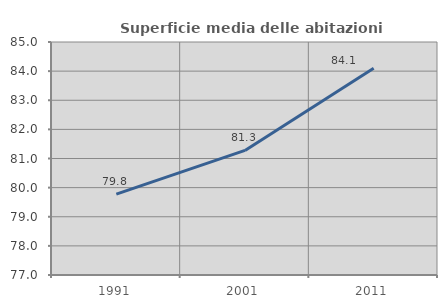
| Category | Superficie media delle abitazioni occupate |
|---|---|
| 1991.0 | 79.777 |
| 2001.0 | 81.277 |
| 2011.0 | 84.102 |